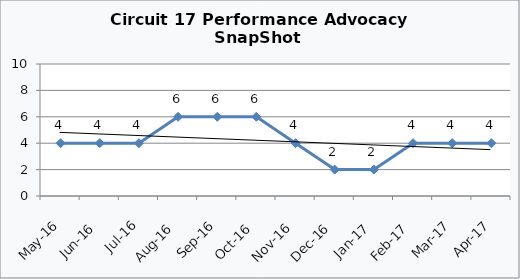
| Category | Circuit 17 |
|---|---|
| May-16 | 4 |
| Jun-16 | 4 |
| Jul-16 | 4 |
| Aug-16 | 6 |
| Sep-16 | 6 |
| Oct-16 | 6 |
| Nov-16 | 4 |
| Dec-16 | 2 |
| Jan-17 | 2 |
| Feb-17 | 4 |
| Mar-17 | 4 |
| Apr-17 | 4 |